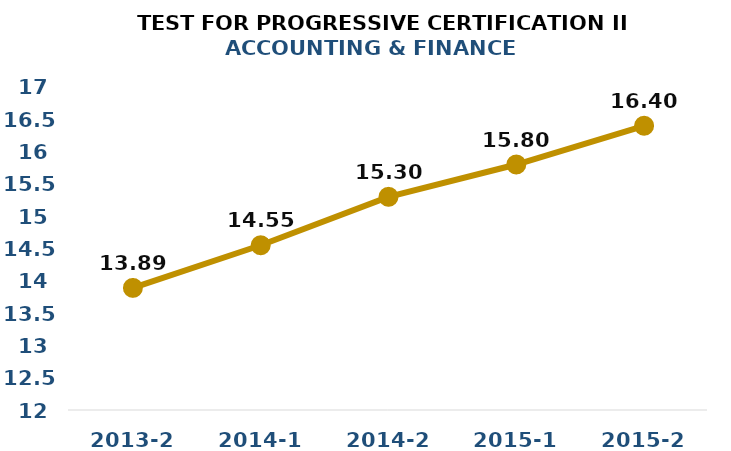
| Category | Series 0 |
|---|---|
| 2013-2 | 13.89 |
| 2014-1 | 14.55 |
| 2014-2 | 15.3 |
| 2015-1 | 15.8 |
| 2015-2 | 16.4 |